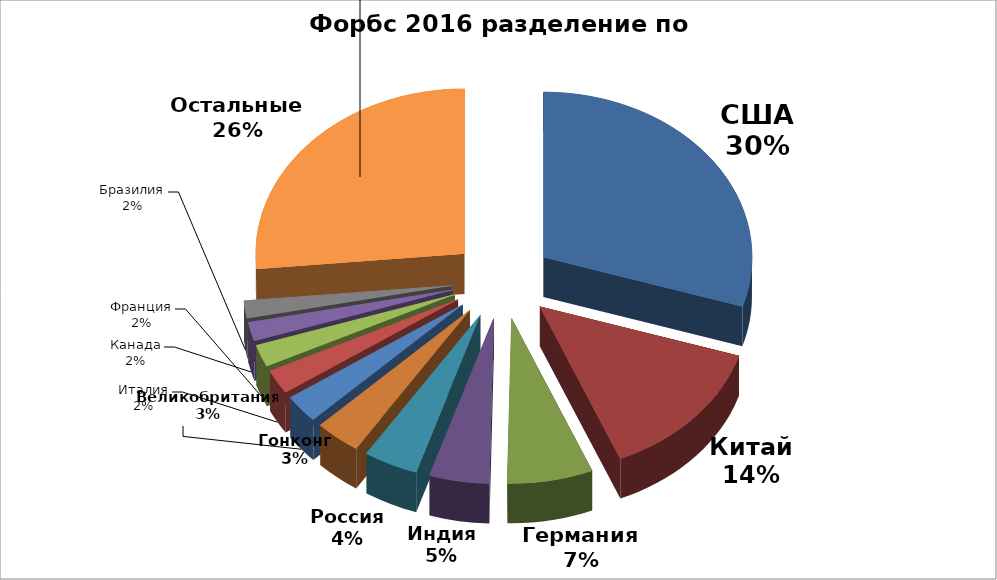
| Category | Series 0 |
|---|---|
| США | 540 |
| Китай | 251 |
| Германия | 120 |
| Индия | 84 |
| Россия | 76 |
| Гонконг | 64 |
| Великобритания | 50 |
| Италия | 43 |
| Франция | 39 |
| Канада | 33 |
| Бразилия | 31 |
| Остальные | 479 |